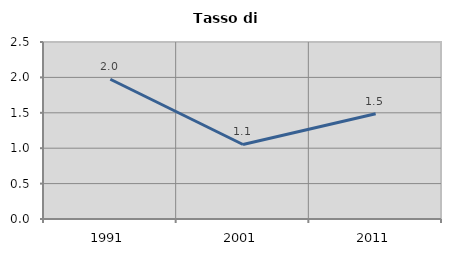
| Category | Tasso di disoccupazione   |
|---|---|
| 1991.0 | 1.974 |
| 2001.0 | 1.053 |
| 2011.0 | 1.488 |